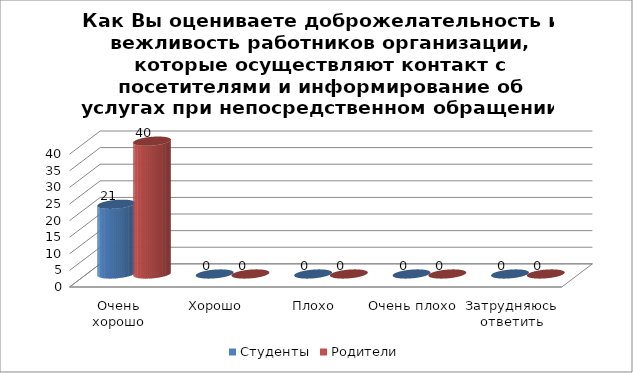
| Category | Студенты | Родители |
|---|---|---|
| Очень хорошо | 21 | 40 |
| Хорошо | 0 | 0 |
| Плохо | 0 | 0 |
| Очень плохо | 0 | 0 |
| Затрудняюсь ответить | 0 | 0 |